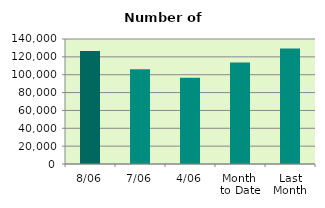
| Category | Series 0 |
|---|---|
| 8/06 | 126700 |
| 7/06 | 106034 |
| 4/06 | 96540 |
| Month 
to Date | 113609 |
| Last
Month | 129378.19 |